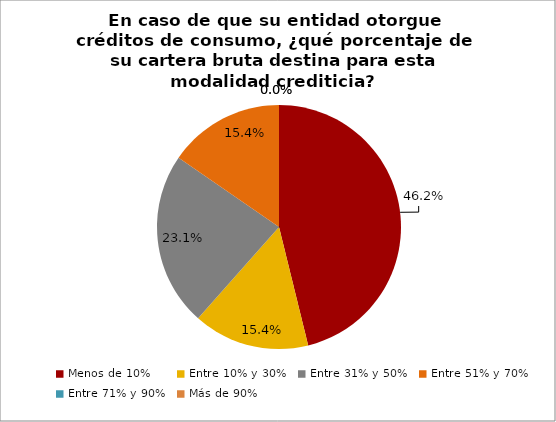
| Category | Series 0 |
|---|---|
| Menos de 10% | 0.462 |
| Entre 10% y 30% | 0.154 |
| Entre 31% y 50% | 0.231 |
| Entre 51% y 70% | 0.154 |
| Entre 71% y 90% | 0 |
| Más de 90% | 0 |